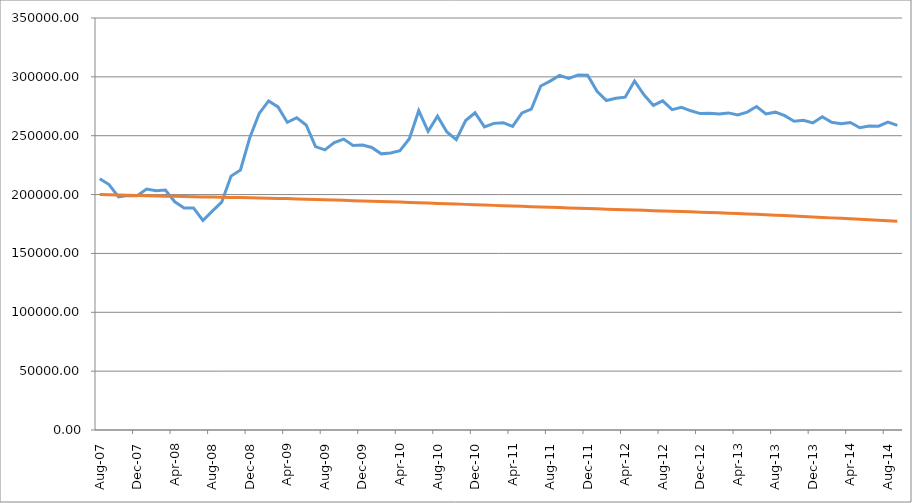
| Category | Series 0 | Series 1 |
|---|---|---|
| 2007-08-01 | 213385.323 | 200000 |
| 2007-09-01 | 208515.199 | 199797.447 |
| 2007-10-01 | 198068.26 | 199593.896 |
| 2007-11-01 | 199266.697 | 199404 |
| 2007-12-01 | 199039.093 | 199213.107 |
| 2008-01-01 | 204613.007 | 199021.211 |
| 2008-02-01 | 203166.575 | 198848.597 |
| 2008-03-01 | 203784.856 | 198674.993 |
| 2008-04-01 | 193884.643 | 198500.394 |
| 2008-05-01 | 188540.324 | 198339.995 |
| 2008-06-01 | 188669.885 | 198178.613 |
| 2008-07-01 | 178002.642 | 198016.242 |
| 2008-08-01 | 185928.662 | 197867.927 |
| 2008-09-01 | 193539.324 | 197718.642 |
| 2008-10-01 | 215680.457 | 197568.38 |
| 2008-11-01 | 220892.831 | 197416.552 |
| 2008-12-01 | 248494.481 | 197263.733 |
| 2009-01-01 | 268918.181 | 197109.917 |
| 2009-02-01 | 279562.634 | 196931.589 |
| 2009-03-01 | 274495.448 | 196752.209 |
| 2009-04-01 | 261303.666 | 196571.771 |
| 2009-05-01 | 265238.997 | 196324.924 |
| 2009-06-01 | 259082.639 | 196076.972 |
| 2009-07-01 | 240741.858 | 195827.91 |
| 2009-08-01 | 237946.367 | 195589.212 |
| 2009-09-01 | 244153.355 | 195349.391 |
| 2009-10-01 | 247105.204 | 195108.444 |
| 2009-11-01 | 241712.327 | 194855.284 |
| 2009-12-01 | 242010.685 | 194600.988 |
| 2010-01-01 | 240049.037 | 194345.553 |
| 2010-02-01 | 234602.459 | 194092.864 |
| 2010-03-01 | 235301.947 | 193839.024 |
| 2010-04-01 | 237261.043 | 193584.027 |
| 2010-05-01 | 247410.841 | 193320.454 |
| 2010-06-01 | 271249.204 | 193055.718 |
| 2010-07-01 | 253709.78 | 192789.812 |
| 2010-08-01 | 266612.077 | 192512.406 |
| 2010-09-01 | 253178.556 | 192233.828 |
| 2010-10-01 | 246654.31 | 191954.074 |
| 2010-11-01 | 262887.122 | 191671.764 |
| 2010-12-01 | 269511.592 | 191388.269 |
| 2011-01-01 | 257486.95 | 191103.584 |
| 2011-02-01 | 260479.098 | 190822.717 |
| 2011-03-01 | 261055.971 | 190540.645 |
| 2011-04-01 | 257890.38 | 190257.363 |
| 2011-05-01 | 269395.853 | 189983.583 |
| 2011-06-01 | 272602.023 | 189708.573 |
| 2011-07-01 | 292261.741 | 189432.328 |
| 2011-08-01 | 296387.132 | 189176.183 |
| 2011-09-01 | 301191.094 | 188918.781 |
| 2011-10-01 | 298744.548 | 188660.116 |
| 2011-11-01 | 301672.782 | 188403.069 |
| 2011-12-01 | 301310.668 | 188144.746 |
| 2012-01-01 | 287708.815 | 187885.14 |
| 2012-02-01 | 279895.593 | 187633.583 |
| 2012-03-01 | 281755.984 | 187380.729 |
| 2012-04-01 | 282754.002 | 187126.571 |
| 2012-05-01 | 296496.415 | 186869.088 |
| 2012-06-01 | 284795.108 | 186610.287 |
| 2012-07-01 | 275761.971 | 186350.162 |
| 2012-08-01 | 279655.899 | 186096.32 |
| 2012-09-01 | 272144.751 | 185841.138 |
| 2012-10-01 | 274182.905 | 185584.611 |
| 2012-11-01 | 271153.315 | 185318.274 |
| 2012-12-01 | 268812.497 | 185050.577 |
| 2013-01-01 | 269131.115 | 184781.516 |
| 2013-02-01 | 268513.528 | 184477.146 |
| 2013-03-01 | 269385.68 | 184171.424 |
| 2013-04-01 | 267579.931 | 183864.345 |
| 2013-05-01 | 270048.165 | 183546.781 |
| 2013-06-01 | 274796.037 | 183227.859 |
| 2013-07-01 | 268435.85 | 182907.574 |
| 2013-08-01 | 270000.104 | 182526.669 |
| 2013-09-01 | 267029.786 | 182144.517 |
| 2013-10-01 | 262309.405 | 181761.113 |
| 2013-11-01 | 263036.703 | 181373.291 |
| 2013-12-01 | 260850.039 | 180984.218 |
| 2014-01-01 | 266192.261 | 180593.89 |
| 2014-02-01 | 261409.429 | 180204.409 |
| 2014-03-01 | 260167.004 | 179813.66 |
| 2014-04-01 | 261271.458 | 179421.637 |
| 2014-05-01 | 256757.309 | 179028.336 |
| 2014-06-01 | 258283.864 | 178633.755 |
| 2014-07-01 | 258103.472 | 178237.887 |
| 2014-08-01 | 261499.987 | 177839.159 |
| 2014-09-01 | 258787.513 | 177439.141 |